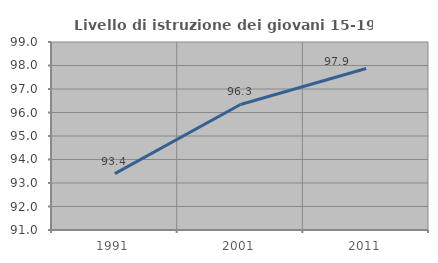
| Category | Livello di istruzione dei giovani 15-19 anni |
|---|---|
| 1991.0 | 93.396 |
| 2001.0 | 96.341 |
| 2011.0 | 97.872 |